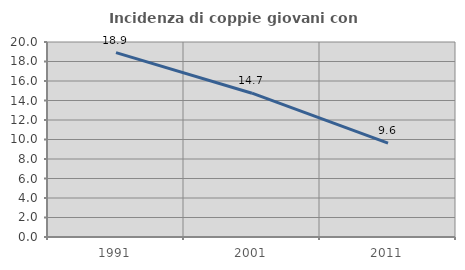
| Category | Incidenza di coppie giovani con figli |
|---|---|
| 1991.0 | 18.908 |
| 2001.0 | 14.747 |
| 2011.0 | 9.634 |